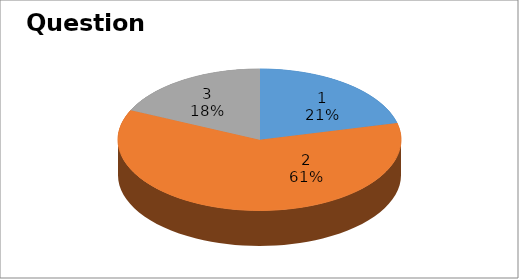
| Category | Series 0 |
|---|---|
| 0 | 7 |
| 1 | 20 |
| 2 | 6 |